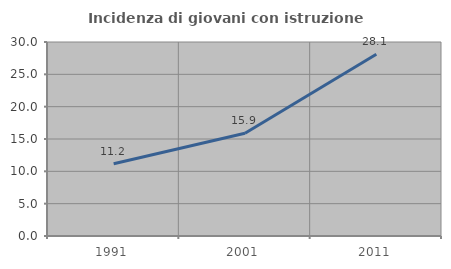
| Category | Incidenza di giovani con istruzione universitaria |
|---|---|
| 1991.0 | 11.172 |
| 2001.0 | 15.881 |
| 2011.0 | 28.101 |